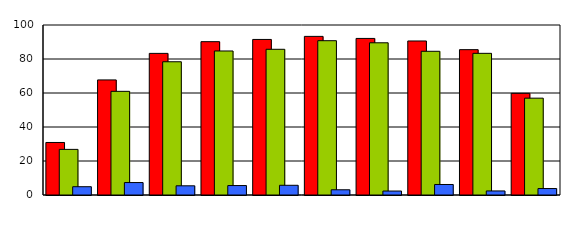
| Category | Series 0 | Series 1 | Series 2 |
|---|---|---|---|
| 0 | 30.9 | 26.829 | 4.878 |
| 1 | 67.7 | 60.976 | 7.317 |
| 2 | 83.3 | 78.378 | 5.405 |
| 3 | 90.2 | 84.722 | 5.556 |
| 4 | 91.5 | 85.714 | 5.714 |
| 5 | 93.3 | 90.769 | 3.077 |
| 6 | 92.1 | 89.535 | 2.326 |
| 7 | 90.6 | 84.536 | 6.186 |
| 8 | 85.5 | 83.333 | 2.381 |
| 9 | 59.8 | 56.962 | 3.797 |